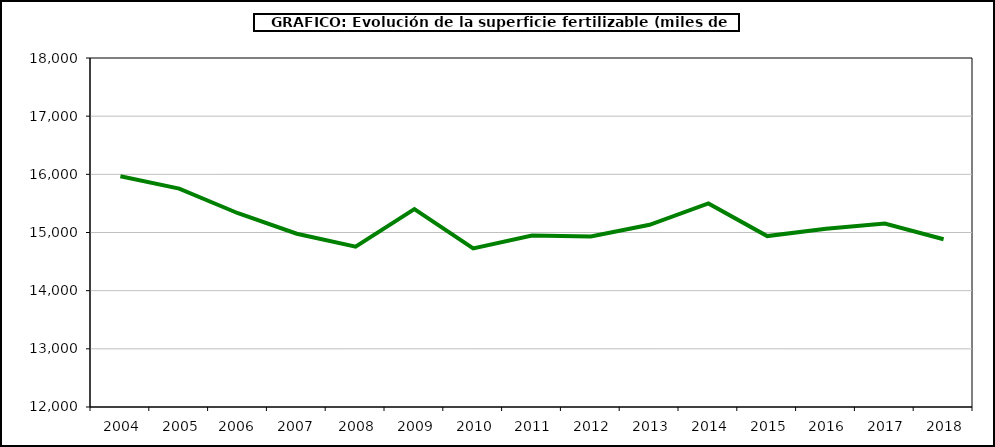
| Category | fertilizantes |
|---|---|
|   2004 | 15965.705 |
|   2005 | 15754.807 |
|   2006  | 15331.413 |
|   2007  | 14979.076 |
|   2008 | 14757 |
|   2009 | 15402 |
|   2010 | 14727 |
|   2011 | 14947 |
|   2012 | 14932 |
|   2013 | 15133 |
|   2014 | 15499 |
|   2015 | 14938 |
|   2016 | 15065 |
|   2017 | 15153 |
|   2018 | 14883 |